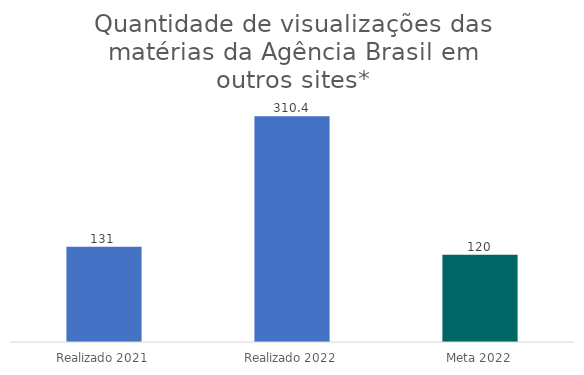
| Category | Quantidade de visualizações das matérias da Agência Brasil em outros sites

 |
|---|---|
| Realizado 2021 | 131 |
| Realizado 2022 | 310.4 |
| Meta 2022 | 120 |